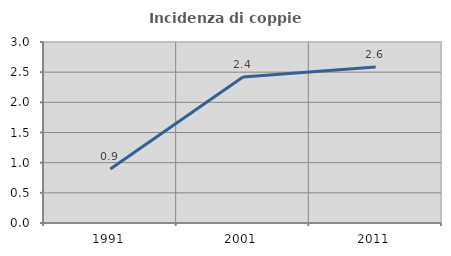
| Category | Incidenza di coppie miste |
|---|---|
| 1991.0 | 0.897 |
| 2001.0 | 2.421 |
| 2011.0 | 2.587 |